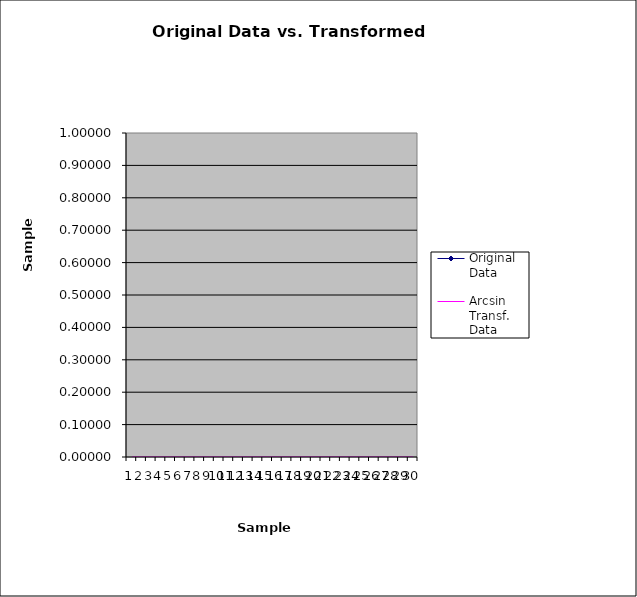
| Category | Original Data | Arcsin Transf. Data |
|---|---|---|
| 0 |  | 0 |
| 1 |  | 0 |
| 2 |  | 0 |
| 3 |  | 0 |
| 4 |  | 0 |
| 5 |  | 0 |
| 6 |  | 0 |
| 7 |  | 0 |
| 8 |  | 0 |
| 9 |  | 0 |
| 10 |  | 0 |
| 11 |  | 0 |
| 12 |  | 0 |
| 13 |  | 0 |
| 14 |  | 0 |
| 15 |  | 0 |
| 16 |  | 0 |
| 17 |  | 0 |
| 18 |  | 0 |
| 19 |  | 0 |
| 20 |  | 0 |
| 21 |  | 0 |
| 22 |  | 0 |
| 23 |  | 0 |
| 24 |  | 0 |
| 25 |  | 0 |
| 26 |  | 0 |
| 27 |  | 0 |
| 28 |  | 0 |
| 29 |  | 0 |